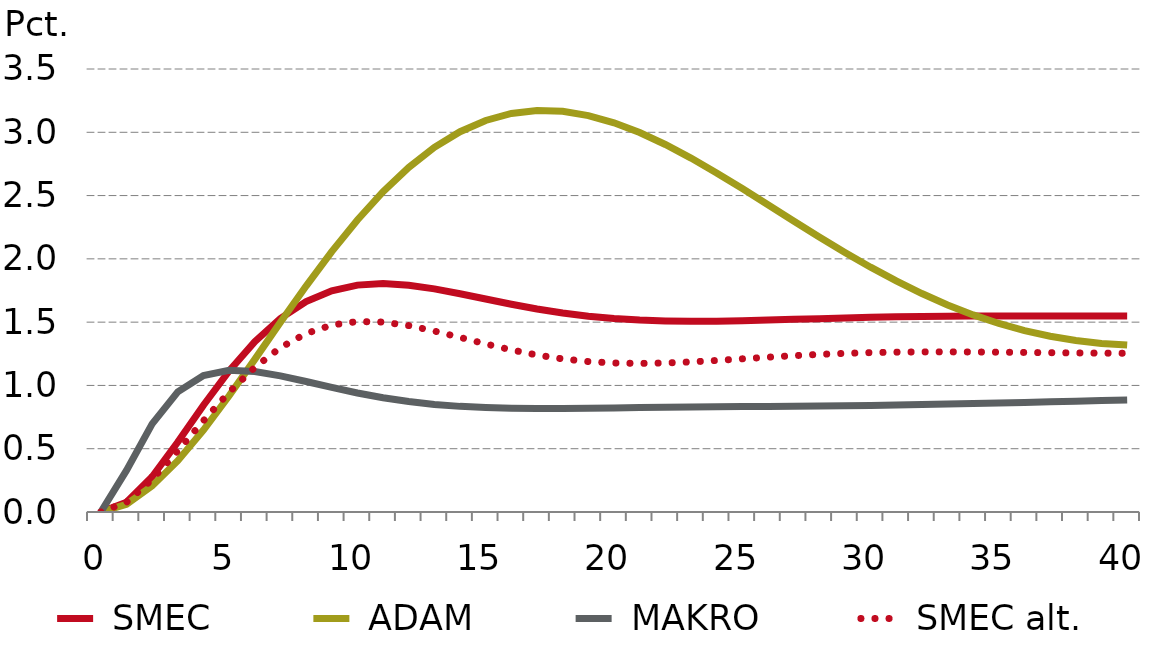
| Category |  SMEC |  ADAM |  MAKRO |  SMEC alt.  |
|---|---|---|---|---|
| 0.0 | 0 | 0 | 0 | 0 |
| nan | 0.077 | 0.061 | 0.328 | 0.077 |
| nan | 0.278 | 0.206 | 0.696 | 0.257 |
| nan | 0.553 | 0.406 | 0.95 | 0.484 |
| nan | 0.844 | 0.647 | 1.078 | 0.721 |
| 5.0 | 1.114 | 0.918 | 1.119 | 0.946 |
| nan | 1.346 | 1.206 | 1.11 | 1.143 |
| nan | 1.529 | 1.498 | 1.076 | 1.299 |
| nan | 1.662 | 1.785 | 1.031 | 1.41 |
| nan | 1.748 | 2.057 | 0.984 | 1.477 |
| 10.0 | 1.793 | 2.307 | 0.941 | 1.505 |
| nan | 1.804 | 2.53 | 0.903 | 1.501 |
| nan | 1.792 | 2.722 | 0.872 | 1.473 |
| nan | 1.763 | 2.881 | 0.85 | 1.43 |
| nan | 1.725 | 3.005 | 0.835 | 1.379 |
| 15.0 | 1.683 | 3.094 | 0.825 | 1.328 |
| nan | 1.642 | 3.149 | 0.819 | 1.28 |
| nan | 1.604 | 3.172 | 0.817 | 1.24 |
| nan | 1.572 | 3.166 | 0.818 | 1.21 |
| nan | 1.547 | 3.132 | 0.819 | 1.189 |
| 20.0 | 1.528 | 3.075 | 0.822 | 1.177 |
| nan | 1.516 | 2.998 | 0.825 | 1.174 |
| nan | 1.509 | 2.904 | 0.827 | 1.177 |
| nan | 1.507 | 2.796 | 0.83 | 1.186 |
| nan | 1.508 | 2.679 | 0.832 | 1.197 |
| 25.0 | 1.511 | 2.555 | 0.833 | 1.21 |
| nan | 1.516 | 2.428 | 0.834 | 1.223 |
| nan | 1.522 | 2.299 | 0.836 | 1.235 |
| nan | 1.528 | 2.173 | 0.838 | 1.245 |
| nan | 1.533 | 2.051 | 0.84 | 1.253 |
| 30.0 | 1.538 | 1.934 | 0.842 | 1.259 |
| nan | 1.542 | 1.826 | 0.845 | 1.263 |
| nan | 1.545 | 1.726 | 0.849 | 1.265 |
| nan | 1.547 | 1.636 | 0.853 | 1.265 |
| nan | 1.548 | 1.557 | 0.857 | 1.264 |
| 35.0 | 1.549 | 1.489 | 0.861 | 1.263 |
| nan | 1.549 | 1.433 | 0.866 | 1.261 |
| nan | 1.549 | 1.388 | 0.87 | 1.259 |
| nan | 1.549 | 1.355 | 0.875 | 1.257 |
| nan | 1.549 | 1.332 | 0.88 | 1.255 |
| 40.0 | 1.548 | 1.32 | 0.885 | 1.254 |